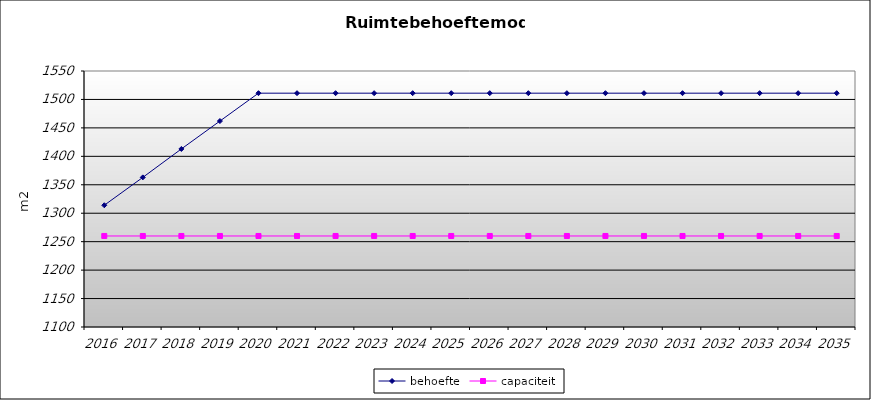
| Category | behoefte | capaciteit |
|---|---|---|
| 2016.0 | 1314 | 1260 |
| 2017.0 | 1363 | 1260 |
| 2018.0 | 1413 | 1260 |
| 2019.0 | 1462 | 1260 |
| 2020.0 | 1511 | 1260 |
| 2021.0 | 1511 | 1260 |
| 2022.0 | 1511 | 1260 |
| 2023.0 | 1511 | 1260 |
| 2024.0 | 1511 | 1260 |
| 2025.0 | 1511 | 1260 |
| 2026.0 | 1511 | 1260 |
| 2027.0 | 1511 | 1260 |
| 2028.0 | 1511 | 1260 |
| 2029.0 | 1511 | 1260 |
| 2030.0 | 1511 | 1260 |
| 2031.0 | 1511 | 1260 |
| 2032.0 | 1511 | 1260 |
| 2033.0 | 1511 | 1260 |
| 2034.0 | 1511 | 1260 |
| 2035.0 | 1511 | 1260 |